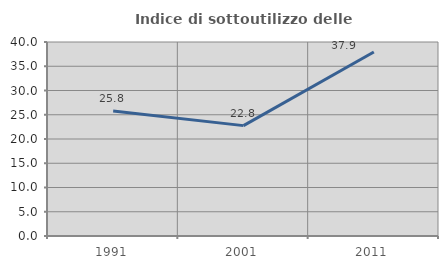
| Category | Indice di sottoutilizzo delle abitazioni  |
|---|---|
| 1991.0 | 25.786 |
| 2001.0 | 22.759 |
| 2011.0 | 37.931 |